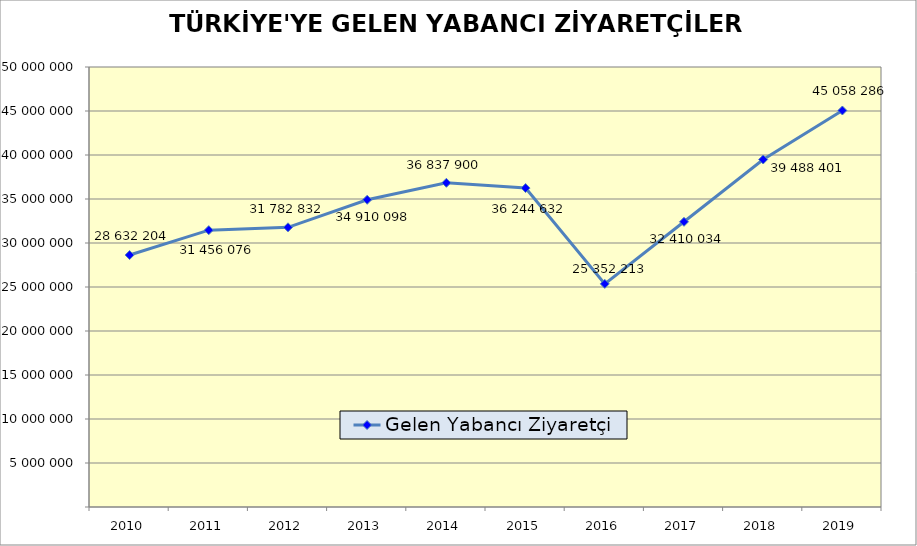
| Category | Gelen Yabancı Ziyaretçi |
|---|---|
| 2010.0 | 28632204 |
| 2011.0 | 31456076 |
| 2012.0 | 31782832 |
| 2013.0 | 34910098 |
| 2014.0 | 36837900 |
| 2015.0 | 36244632 |
| 2016.0 | 25352213 |
| 2017.0 | 32410034 |
| 2018.0 | 39488401 |
| 2019.0 | 45058286 |